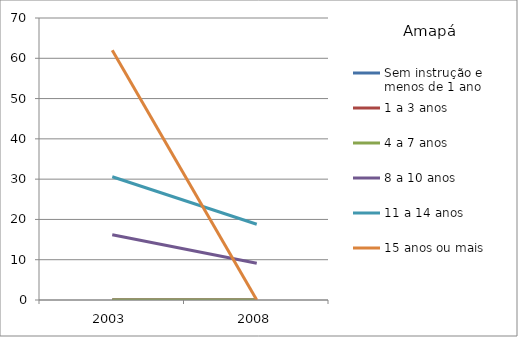
| Category | Sem instrução e menos de 1 ano | 1 a 3 anos | 4 a 7 anos | 8 a 10 anos | 11 a 14 anos | 15 anos ou mais |
|---|---|---|---|---|---|---|
| 2003.0 | 0 | 0 | 0 | 16.2 | 30.6 | 62 |
| 2008.0 | 0 | 0 | 0 | 9.1 | 18.8 | 0 |